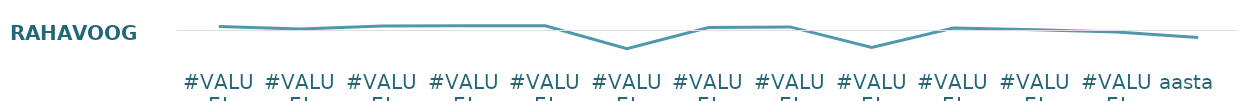
| Category | Rahavoog |
|---|---|
| #VALUE! | 169 |
| #VALUE! | 69 |
| #VALUE! | 192 |
| #VALUE! | 199 |
| #VALUE! | 204 |
| #VALUE! | -771 |
| #VALUE! | 124 |
| #VALUE! | 154 |
| #VALUE! | -721 |
| #VALUE! | 109 |
| #VALUE! | 34 |
| #VALUE! | -61 |
| aasta   | -299 |